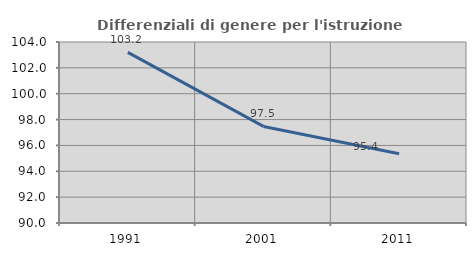
| Category | Differenziali di genere per l'istruzione superiore |
|---|---|
| 1991.0 | 103.199 |
| 2001.0 | 97.469 |
| 2011.0 | 95.358 |